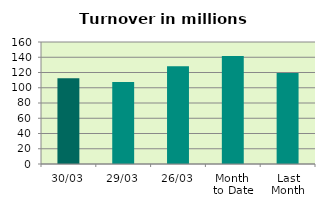
| Category | Series 0 |
|---|---|
| 30/03 | 112.34 |
| 29/03 | 107.597 |
| 26/03 | 128.037 |
| Month 
to Date | 141.79 |
| Last
Month | 119.242 |